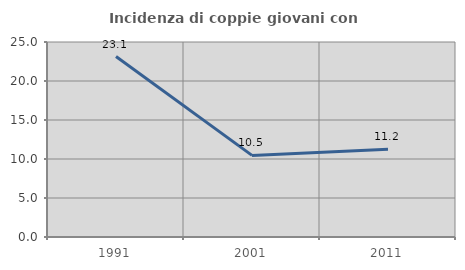
| Category | Incidenza di coppie giovani con figli |
|---|---|
| 1991.0 | 23.14 |
| 2001.0 | 10.46 |
| 2011.0 | 11.242 |